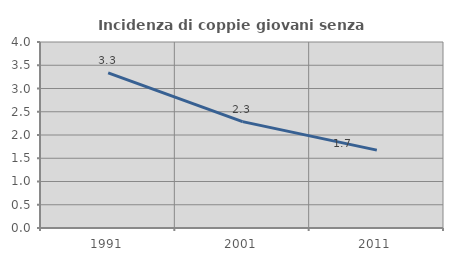
| Category | Incidenza di coppie giovani senza figli |
|---|---|
| 1991.0 | 3.337 |
| 2001.0 | 2.288 |
| 2011.0 | 1.674 |